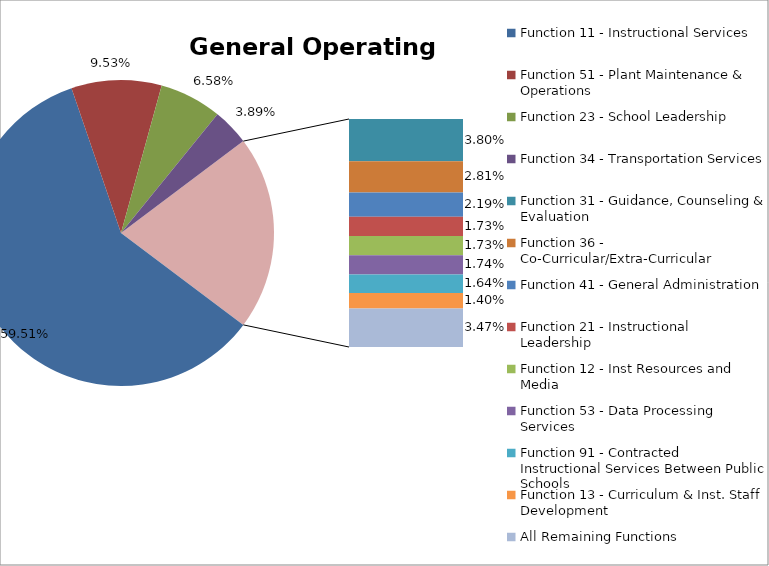
| Category | Series 0 |
|---|---|
| Function 11 - Instructional Services | 0.595 |
| Function 51 - Plant Maintenance & Operations | 0.095 |
| Function 23 - School Leadership | 0.066 |
| Function 34 - Transportation Services | 0.039 |
| Function 31 - Guidance, Counseling & Evaluation | 0.038 |
| Function 36 - Co-Curricular/Extra-Curricular | 0.028 |
| Function 41 - General Administration | 0.022 |
| Function 21 - Instructional Leadership | 0.017 |
| Function 12 - Inst Resources and Media | 0.017 |
| Function 53 - Data Processing Services | 0.017 |
| Function 91 - Contracted Instructional Services Between Public Schools | 0.016 |
| Function 13 - Curriculum & Inst. Staff Development | 0.014 |
| All Remaining Functions | 0.035 |